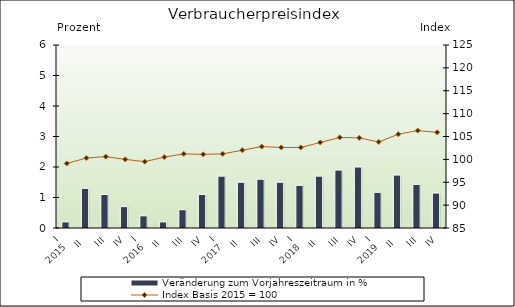
| Category | Veränderung zum Vorjahreszeitraum in % |
|---|---|
| 0 | 0.2 |
| 1 | 1.3 |
| 2 | 1.1 |
| 3 | 0.7 |
| 4 | 0.4 |
| 5 | 0.2 |
| 6 | 0.6 |
| 7 | 1.1 |
| 8 | 1.7 |
| 9 | 1.5 |
| 10 | 1.6 |
| 11 | 1.5 |
| 12 | 1.4 |
| 13 | 1.7 |
| 14 | 1.9 |
| 15 | 2 |
| 16 | 1.17 |
| 17 | 1.736 |
| 18 | 1.431 |
| 19 | 1.146 |